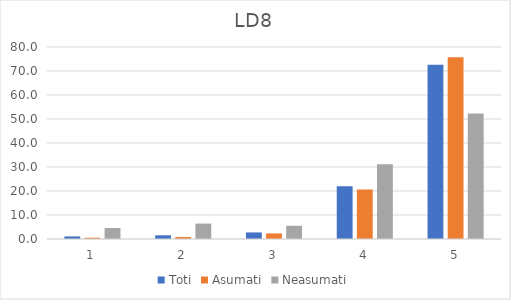
| Category | Toti | Asumati | Neasumati |
|---|---|---|---|
| 0 | 1.07 | 0.546 | 4.587 |
| 1 | 1.546 | 0.82 | 6.422 |
| 2 | 2.735 | 2.322 | 5.505 |
| 3 | 21.998 | 20.628 | 31.193 |
| 4 | 72.652 | 75.683 | 52.294 |